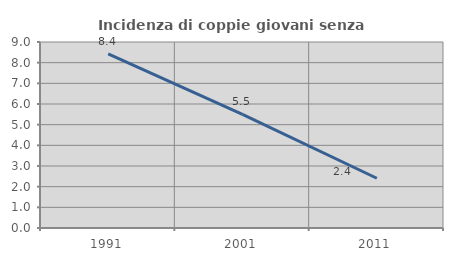
| Category | Incidenza di coppie giovani senza figli |
|---|---|
| 1991.0 | 8.426 |
| 2001.0 | 5.497 |
| 2011.0 | 2.407 |